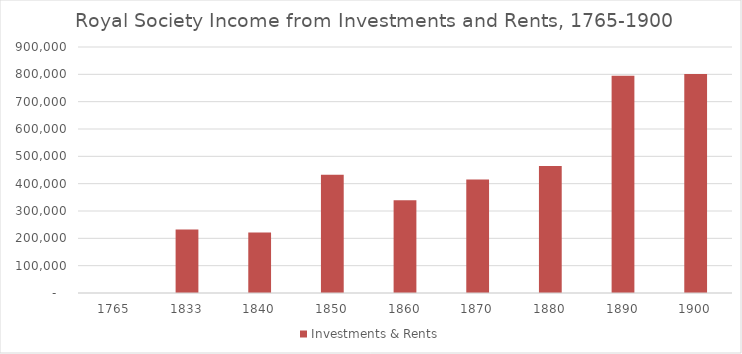
| Category | Investments & Rents |
|---|---|
| 1765.0 | 0 |
| 1833.0 | 232238 |
| 1840.0 | 221029 |
| 1850.0 | 432631 |
| 1860.0 | 339305 |
| 1870.0 | 415600 |
| 1880.0 | 464251 |
| 1890.0 | 794435 |
| 1900.0 | 801548 |